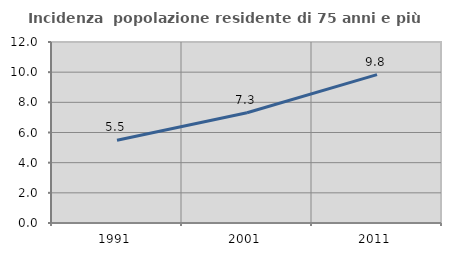
| Category | Incidenza  popolazione residente di 75 anni e più |
|---|---|
| 1991.0 | 5.488 |
| 2001.0 | 7.311 |
| 2011.0 | 9.838 |